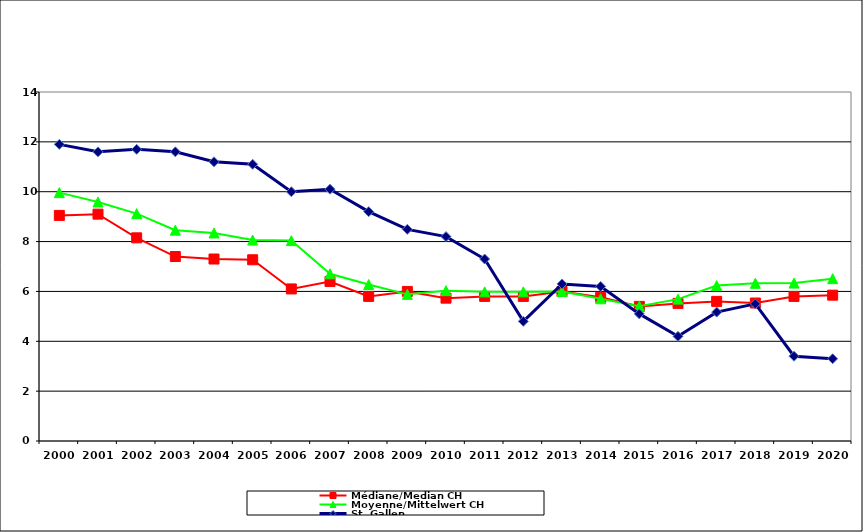
| Category | Médiane/Median CH | Moyenne/Mittelwert CH | St. Gallen |
|---|---|---|---|
| 2000.0 | 9.05 | 9.964 | 11.9 |
| 2001.0 | 9.1 | 9.588 | 11.6 |
| 2002.0 | 8.15 | 9.121 | 11.7 |
| 2003.0 | 7.4 | 8.458 | 11.6 |
| 2004.0 | 7.3 | 8.345 | 11.2 |
| 2005.0 | 7.27 | 8.061 | 11.1 |
| 2006.0 | 6.1 | 8.039 | 10 |
| 2007.0 | 6.4 | 6.706 | 10.1 |
| 2008.0 | 5.8 | 6.277 | 9.2 |
| 2009.0 | 6 | 5.883 | 8.49 |
| 2010.0 | 5.73 | 6.031 | 8.2 |
| 2011.0 | 5.8 | 5.983 | 7.3 |
| 2012.0 | 5.8 | 5.983 | 4.8 |
| 2013.0 | 6 | 5.994 | 6.3 |
| 2014.0 | 5.765 | 5.705 | 6.2 |
| 2015.0 | 5.4 | 5.408 | 5.1 |
| 2016.0 | 5.52 | 5.692 | 4.2 |
| 2017.0 | 5.6 | 6.235 | 5.17 |
| 2018.0 | 5.535 | 6.326 | 5.5 |
| 2019.0 | 5.8 | 6.335 | 3.4 |
| 2020.0 | 5.85 | 6.512 | 3.3 |